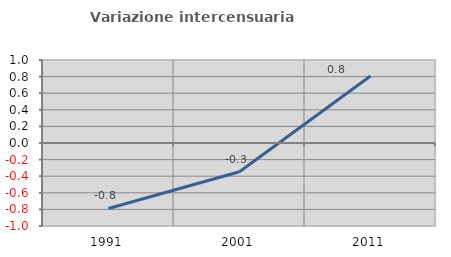
| Category | Variazione intercensuaria annua |
|---|---|
| 1991.0 | -0.789 |
| 2001.0 | -0.347 |
| 2011.0 | 0.806 |